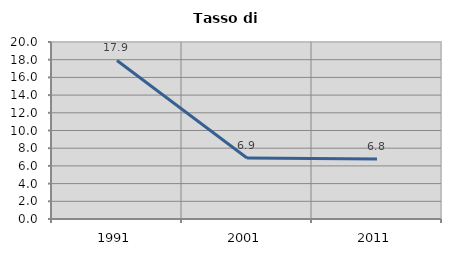
| Category | Tasso di disoccupazione   |
|---|---|
| 1991.0 | 17.91 |
| 2001.0 | 6.897 |
| 2011.0 | 6.78 |